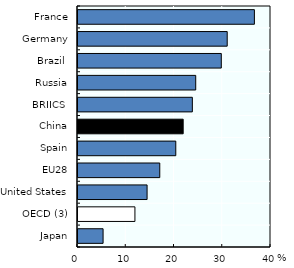
| Category | Series 1 |
|---|---|
| Japan | 5.2 |
| OECD (3) | 11.8 |
| United States | 14.318 |
| EU28 | 16.948 |
| Spain | 20.269 |
| China | 21.8 |
| BRIICS  | 23.7 |
| Russia | 24.4 |
| Brazil  | 29.7 |
| Germany | 30.924 |
| France | 36.558 |